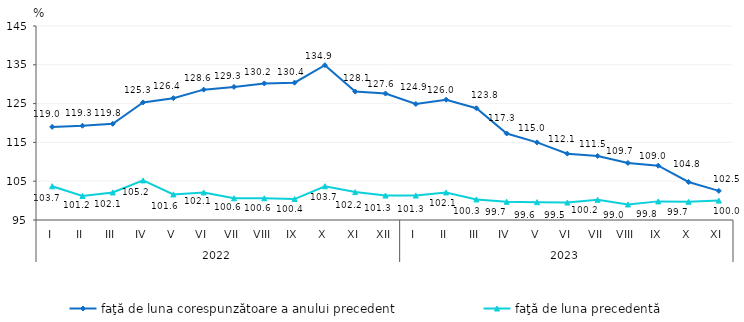
| Category | faţă de luna corespunzătoare a anului precedent | faţă de luna precedentă   |
|---|---|---|
| 0 | 119 | 103.7 |
| 1 | 119.3 | 101.2 |
| 2 | 119.8 | 102.1 |
| 3 | 125.3 | 105.2 |
| 4 | 126.4 | 101.6 |
| 5 | 128.6 | 102.1 |
| 6 | 129.3 | 100.6 |
| 7 | 130.2 | 100.6 |
| 8 | 130.4 | 100.4 |
| 9 | 134.9 | 103.7 |
| 10 | 128.1 | 102.2 |
| 11 | 127.6 | 101.3 |
| 12 | 124.9 | 101.3 |
| 13 | 126 | 102.1 |
| 14 | 123.8 | 100.3 |
| 15 | 117.3 | 99.7 |
| 16 | 115 | 99.6 |
| 17 | 112.1 | 99.5 |
| 18 | 111.5 | 100.2 |
| 19 | 109.7 | 99 |
| 20 | 109 | 99.8 |
| 21 | 104.8 | 99.7 |
| 22 | 102.5 | 100 |